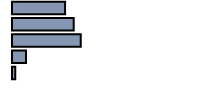
| Category | Series 0 |
|---|---|
| 0 | 26.4 |
| 1 | 30.7 |
| 2 | 34.2 |
| 3 | 7 |
| 4 | 1.6 |